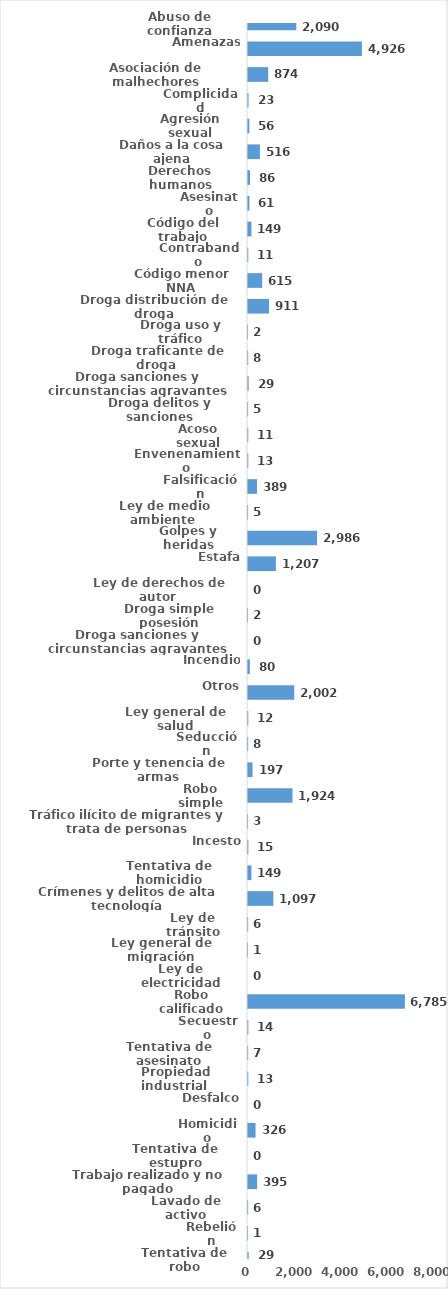
| Category | Series 0 |
|---|---|
| Abuso de confianza | 2090 |
| Amenazas | 4926 |
| Asociación de malhechores | 874 |
| Complicidad | 23 |
| Agresión sexual | 56 |
| Daños a la cosa ajena | 516 |
| Derechos humanos | 86 |
| Asesinato | 61 |
| Código del trabajo | 149 |
| Contrabando | 11 |
| Código menor NNA | 615 |
| Droga distribución de droga | 911 |
| Droga uso y tráfico | 2 |
| Droga traficante de droga  | 8 |
| Droga sanciones y circunstancias agravantes | 29 |
| Droga delitos y sanciones | 5 |
| Acoso sexual | 11 |
| Envenenamiento | 13 |
| Falsificación | 389 |
| Ley de medio ambiente  | 5 |
| Golpes y heridas | 2986 |
| Estafa | 1207 |
| Ley de derechos de autor  | 0 |
| Droga simple posesión | 2 |
| Droga sanciones y circunstancias agravantes | 0 |
| Incendio | 80 |
| Otros | 2002 |
| Ley general de salud | 12 |
| Seducción | 8 |
| Porte y tenencia de armas | 197 |
| Robo simple | 1924 |
| Tráfico ilícito de migrantes y trata de personas | 3 |
| Incesto | 15 |
| Tentativa de homicidio | 149 |
| Crímenes y delitos de alta tecnología | 1097 |
| Ley de tránsito | 6 |
| Ley general de migración | 1 |
| Ley de electricidad | 0 |
| Robo calificado | 6785 |
| Secuestro | 14 |
| Tentativa de asesinato | 7 |
| Propiedad industrial  | 13 |
| Desfalco | 0 |
| Homicidio | 326 |
| Tentativa de estupro | 0 |
| Trabajo realizado y no pagado | 395 |
| Lavado de activo | 6 |
| Rebelión | 1 |
| Tentativa de robo | 29 |